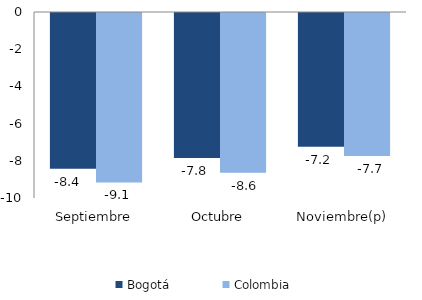
| Category | Bogotá | Colombia |
|---|---|---|
| Septiembre | -8.38 | -9.108 |
| Octubre | -7.801 | -8.593 |
| Noviembre(p) | -7.192 | -7.685 |